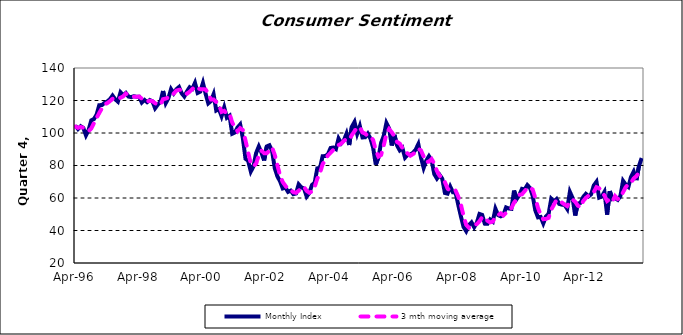
| Category | Monthly Index | 3 mth moving average |
|---|---|---|
| 1996-04-01 | 104.536 | 103.988 |
| 1996-05-01 | 102.445 | 103.146 |
| 1996-06-01 | 104.165 | 103.715 |
| 1996-07-01 | 103.132 | 103.247 |
| 1996-08-01 | 98.548 | 101.948 |
| 1996-09-01 | 101.912 | 101.198 |
| 1996-10-01 | 107.776 | 102.745 |
| 1996-11-01 | 108.57 | 106.086 |
| 1996-12-01 | 111.325 | 109.223 |
| 1997-01-01 | 117.131 | 112.342 |
| 1997-02-01 | 117.193 | 115.216 |
| 1997-03-01 | 118.56 | 117.628 |
| 1997-04-01 | 119.382 | 118.378 |
| 1997-05-01 | 120.759 | 119.567 |
| 1997-06-01 | 123.017 | 121.053 |
| 1997-07-01 | 120.727 | 121.501 |
| 1997-08-01 | 119.291 | 121.012 |
| 1997-09-01 | 125.041 | 121.687 |
| 1997-10-01 | 123.228 | 122.52 |
| 1997-11-01 | 124.634 | 124.301 |
| 1997-12-01 | 122.427 | 123.43 |
| 1998-01-01 | 122.046 | 123.036 |
| 1998-02-01 | 122.65 | 122.374 |
| 1998-03-01 | 122.269 | 122.322 |
| 1998-04-01 | 122.3 | 122.406 |
| 1998-05-01 | 118.744 | 121.104 |
| 1998-06-01 | 120.36 | 120.468 |
| 1998-07-01 | 118.992 | 119.365 |
| 1998-08-01 | 120.28 | 119.877 |
| 1998-09-01 | 119.491 | 119.587 |
| 1998-10-01 | 115.216 | 118.329 |
| 1998-11-01 | 117.44 | 117.382 |
| 1998-12-01 | 119.2 | 117.285 |
| 1999-01-01 | 125.835 | 120.825 |
| 1999-02-01 | 118.371 | 121.136 |
| 1999-03-01 | 121.382 | 121.863 |
| 1999-04-01 | 126.962 | 122.238 |
| 1999-05-01 | 124.381 | 124.242 |
| 1999-06-01 | 126.929 | 126.091 |
| 1999-07-01 | 128.309 | 126.54 |
| 1999-08-01 | 124.42 | 126.553 |
| 1999-09-01 | 122.466 | 125.065 |
| 1999-10-01 | 125.647 | 124.178 |
| 1999-11-01 | 128.163 | 125.426 |
| 1999-12-01 | 127.164 | 126.991 |
| 2000-01-01 | 130.854 | 128.727 |
| 2000-02-01 | 124.642 | 127.553 |
| 2000-03-01 | 125.471 | 126.989 |
| 2000-04-01 | 130.785 | 126.966 |
| 2000-05-01 | 124.1 | 126.785 |
| 2000-06-01 | 118.243 | 124.376 |
| 2000-07-01 | 119.633 | 120.659 |
| 2000-08-01 | 123.854 | 120.577 |
| 2000-09-01 | 113.849 | 119.112 |
| 2000-10-01 | 114.76 | 117.487 |
| 2000-11-01 | 110.348 | 112.986 |
| 2000-12-01 | 115.74 | 113.616 |
| 2001-01-01 | 109.394 | 111.828 |
| 2001-02-01 | 110.585 | 111.907 |
| 2001-03-01 | 99.542 | 106.507 |
| 2001-04-01 | 100.32 | 103.483 |
| 2001-05-01 | 103.365 | 101.076 |
| 2001-06-01 | 105.264 | 102.983 |
| 2001-07-01 | 96.893 | 101.841 |
| 2001-08-01 | 84.156 | 95.438 |
| 2001-09-01 | 82.945 | 87.998 |
| 2001-10-01 | 76.305 | 81.135 |
| 2001-11-01 | 79.442 | 79.564 |
| 2001-12-01 | 87.701 | 81.149 |
| 2002-01-01 | 91.715 | 86.286 |
| 2002-02-01 | 87.952 | 89.123 |
| 2002-03-01 | 83.1 | 87.589 |
| 2002-04-01 | 91.732 | 87.594 |
| 2002-05-01 | 92.449 | 89.094 |
| 2002-06-01 | 88.968 | 91.05 |
| 2002-07-01 | 78.318 | 86.578 |
| 2002-08-01 | 73.284 | 80.19 |
| 2002-09-01 | 70.275 | 73.959 |
| 2002-10-01 | 65.899 | 69.819 |
| 2002-11-01 | 66.462 | 67.545 |
| 2002-12-01 | 63.754 | 65.372 |
| 2003-01-01 | 64.538 | 64.918 |
| 2003-02-01 | 62.348 | 63.547 |
| 2003-03-01 | 62.77 | 63.219 |
| 2003-04-01 | 68.406 | 64.508 |
| 2003-05-01 | 66.543 | 65.906 |
| 2003-06-01 | 65.817 | 66.922 |
| 2003-07-01 | 60.882 | 64.414 |
| 2003-08-01 | 63.048 | 63.249 |
| 2003-09-01 | 68.012 | 63.981 |
| 2003-10-01 | 69.377 | 66.812 |
| 2003-11-01 | 78.239 | 71.876 |
| 2003-12-01 | 78.337 | 75.317 |
| 2004-01-01 | 85.719 | 80.765 |
| 2004-02-01 | 85.823 | 83.293 |
| 2004-03-01 | 86.901 | 86.148 |
| 2004-04-01 | 90.768 | 87.83 |
| 2004-05-01 | 91.067 | 89.578 |
| 2004-06-01 | 90.101 | 90.645 |
| 2004-07-01 | 96.587 | 92.585 |
| 2004-08-01 | 93.595 | 93.427 |
| 2004-09-01 | 95.471 | 95.217 |
| 2004-10-01 | 99.608 | 96.224 |
| 2004-11-01 | 92.605 | 95.895 |
| 2004-12-01 | 103.858 | 98.69 |
| 2005-01-01 | 106.787 | 101.084 |
| 2005-02-01 | 99.524 | 103.39 |
| 2005-03-01 | 104.248 | 103.52 |
| 2005-04-01 | 97.268 | 100.347 |
| 2005-05-01 | 97.391 | 99.636 |
| 2005-06-01 | 99.616 | 98.092 |
| 2005-07-01 | 96.532 | 97.846 |
| 2005-08-01 | 90.996 | 95.714 |
| 2005-09-01 | 80.504 | 89.344 |
| 2005-10-01 | 84.96 | 85.487 |
| 2005-11-01 | 93.966 | 86.477 |
| 2005-12-01 | 98.245 | 92.39 |
| 2006-01-01 | 106.172 | 99.461 |
| 2006-02-01 | 102.898 | 102.438 |
| 2006-03-01 | 92.327 | 100.465 |
| 2006-04-01 | 98.827 | 98.017 |
| 2006-05-01 | 92.311 | 94.488 |
| 2006-06-01 | 89.35 | 93.496 |
| 2006-07-01 | 90.854 | 90.838 |
| 2006-08-01 | 84.831 | 88.345 |
| 2006-09-01 | 86.547 | 87.41 |
| 2006-10-01 | 86.718 | 86.032 |
| 2006-11-01 | 87.859 | 87.041 |
| 2006-12-01 | 89.761 | 88.113 |
| 2007-01-01 | 93.17 | 90.263 |
| 2007-02-01 | 84.86 | 89.264 |
| 2007-03-01 | 78.529 | 85.52 |
| 2007-04-01 | 82.999 | 82.129 |
| 2007-05-01 | 85.732 | 82.42 |
| 2007-06-01 | 83.166 | 83.966 |
| 2007-07-01 | 74.696 | 81.198 |
| 2007-08-01 | 71.97 | 76.611 |
| 2007-09-01 | 74.26 | 73.642 |
| 2007-10-01 | 71.848 | 72.693 |
| 2007-11-01 | 63.082 | 69.73 |
| 2007-12-01 | 62.686 | 65.872 |
| 2008-01-01 | 67.013 | 64.261 |
| 2008-02-01 | 63.502 | 64.4 |
| 2008-03-01 | 63.253 | 64.589 |
| 2008-04-01 | 55.965 | 60.907 |
| 2008-05-01 | 48.813 | 56.011 |
| 2008-06-01 | 42.23 | 49.003 |
| 2008-07-01 | 39.593 | 43.545 |
| 2008-08-01 | 43.372 | 41.731 |
| 2008-09-01 | 45.022 | 42.662 |
| 2008-10-01 | 42.03 | 43.474 |
| 2008-11-01 | 44.769 | 43.94 |
| 2008-12-01 | 50.15 | 45.65 |
| 2009-01-01 | 49.617 | 48.179 |
| 2009-02-01 | 44.201 | 47.99 |
| 2009-03-01 | 44.105 | 45.975 |
| 2009-04-01 | 46.773 | 45.026 |
| 2009-05-01 | 45.478 | 45.452 |
| 2009-06-01 | 53.393 | 48.548 |
| 2009-07-01 | 49.506 | 49.459 |
| 2009-08-01 | 48.726 | 50.541 |
| 2009-09-01 | 49.614 | 49.282 |
| 2009-10-01 | 54.197 | 50.845 |
| 2009-11-01 | 53.578 | 52.463 |
| 2009-12-01 | 53.334 | 53.703 |
| 2010-01-01 | 64.578 | 57.163 |
| 2010-02-01 | 59.383 | 59.098 |
| 2010-03-01 | 61.862 | 61.941 |
| 2010-04-01 | 65.63 | 62.292 |
| 2010-05-01 | 65.286 | 64.259 |
| 2010-06-01 | 67.938 | 66.285 |
| 2010-07-01 | 66.214 | 66.48 |
| 2010-08-01 | 61.426 | 65.193 |
| 2010-09-01 | 52.375 | 60.005 |
| 2010-10-01 | 48.094 | 53.965 |
| 2010-11-01 | 48.365 | 49.611 |
| 2010-12-01 | 44.373 | 46.944 |
| 2011-01-01 | 48.656 | 47.131 |
| 2011-02-01 | 50.295 | 47.775 |
| 2011-03-01 | 59.528 | 52.826 |
| 2011-04-01 | 57.858 | 55.894 |
| 2011-05-01 | 59.365 | 58.917 |
| 2011-06-01 | 56.35 | 57.857 |
| 2011-07-01 | 55.901 | 57.205 |
| 2011-08-01 | 55.829 | 56.027 |
| 2011-09-01 | 53.277 | 55.003 |
| 2011-10-01 | 63.743 | 57.616 |
| 2011-11-01 | 60.076 | 59.032 |
| 2011-12-01 | 49.206 | 57.675 |
| 2012-01-01 | 56.554 | 55.279 |
| 2012-02-01 | 57.034 | 54.265 |
| 2012-03-01 | 60.596 | 58.061 |
| 2012-04-01 | 62.531 | 60.054 |
| 2012-05-01 | 60.96 | 61.362 |
| 2012-06-01 | 62.311 | 61.934 |
| 2012-07-01 | 67.722 | 63.664 |
| 2012-08-01 | 69.97 | 66.668 |
| 2012-09-01 | 60.237 | 65.976 |
| 2012-10-01 | 60.866 | 63.691 |
| 2012-11-01 | 63.757 | 61.62 |
| 2012-12-01 | 49.754 | 58.126 |
| 2013-01-01 | 64.249 | 59.253 |
| 2013-02-01 | 59.369 | 57.791 |
| 2013-03-01 | 59.969 | 61.196 |
| 2013-04-01 | 58.875 | 59.404 |
| 2013-05-01 | 61.196 | 60.013 |
| 2013-06-01 | 70.565 | 63.545 |
| 2013-07-01 | 68.236 | 66.666 |
| 2013-08-01 | 66.818 | 68.539 |
| 2013-09-01 | 73.054 | 69.369 |
| 2013-10-01 | 76.227 | 72.033 |
| 2013-11-01 | 71.023 | 73.435 |
| 2013-12-01 | 79.777 | 75.675 |
| 2014-01-01 | 84.58 | 78.46 |